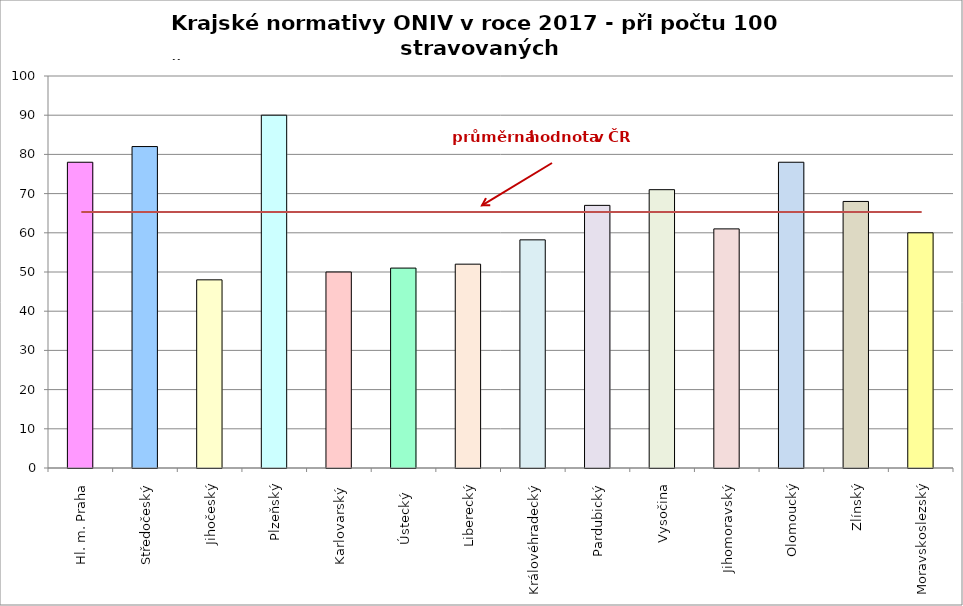
| Category | Series 0 |
|---|---|
| Hl. m. Praha | 78 |
| Středočeský | 82 |
| Jihočeský | 48 |
| Plzeňský | 90 |
| Karlovarský  | 50 |
| Ústecký   | 51 |
| Liberecký | 52 |
| Královéhradecký | 58.2 |
| Pardubický | 67 |
| Vysočina | 71 |
| Jihomoravský | 61 |
| Olomoucký | 78 |
| Zlínský | 68 |
| Moravskoslezský | 60 |